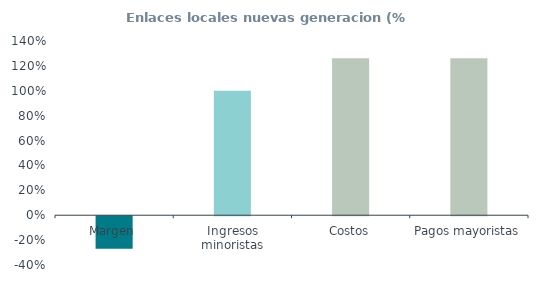
| Category | Enlaces locales nuevas generacion (% ingresos) |
|---|---|
| Margen | -0.261 |
| Ingresos minoristas | 1 |
| Costos | 1.261 |
| Pagos mayoristas | 1.261 |